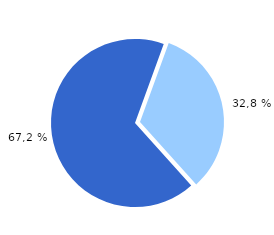
| Category | Series 0 |
|---|---|
| 0 | 5428 |
| 1 | 11134 |